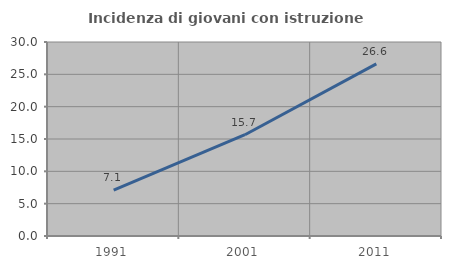
| Category | Incidenza di giovani con istruzione universitaria |
|---|---|
| 1991.0 | 7.086 |
| 2001.0 | 15.66 |
| 2011.0 | 26.612 |